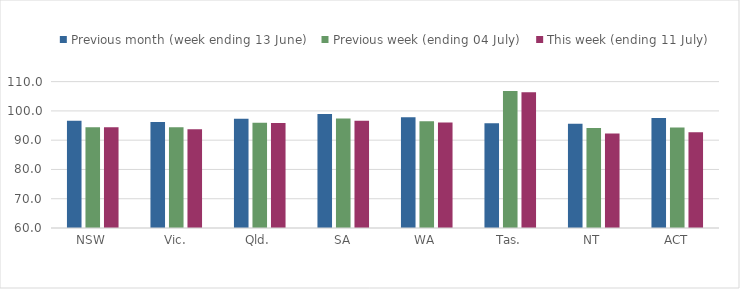
| Category | Previous month (week ending 13 June) | Previous week (ending 04 July) | This week (ending 11 July) |
|---|---|---|---|
| NSW | 96.625 | 94.383 | 94.389 |
| Vic. | 96.185 | 94.404 | 93.697 |
| Qld. | 97.323 | 95.966 | 95.855 |
| SA | 98.908 | 97.396 | 96.666 |
| WA | 97.87 | 96.462 | 96.053 |
| Tas. | 95.772 | 106.829 | 106.416 |
| NT | 95.647 | 94.182 | 92.248 |
| ACT | 97.615 | 94.36 | 92.676 |